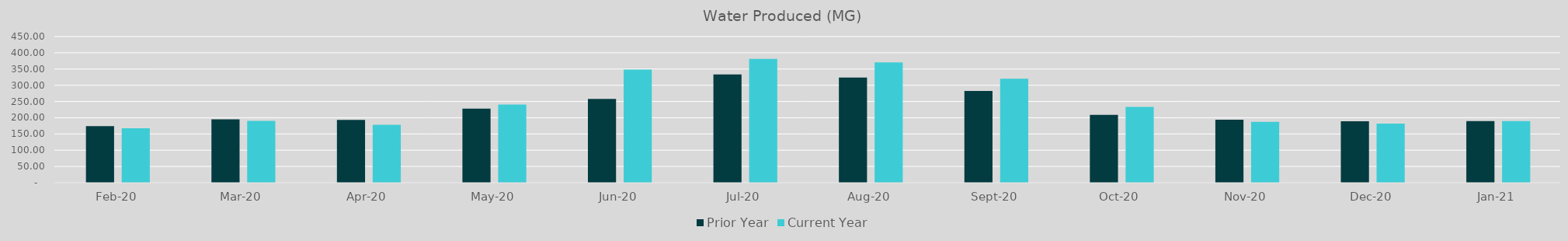
| Category | Prior Year | Current Year |
|---|---|---|
| 2020-02-01 | 173.847 | 167.532 |
| 2020-03-01 | 195.333 | 190.306 |
| 2020-04-01 | 193.551 | 178.22 |
| 2020-05-01 | 228.091 | 240.625 |
| 2020-06-01 | 257.9 | 348.57 |
| 2020-07-01 | 333.37 | 381.34 |
| 2020-08-01 | 323.49 | 370.12 |
| 2020-09-01 | 282.53 | 320.39 |
| 2020-10-01 | 208.72 | 233.34 |
| 2020-11-01 | 193.92 | 187.14 |
| 2020-12-01 | 188.86 | 182.02 |
| 2021-01-01 | 189.94 | 189.96 |